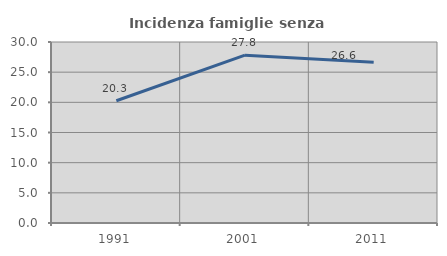
| Category | Incidenza famiglie senza nuclei |
|---|---|
| 1991.0 | 20.256 |
| 2001.0 | 27.813 |
| 2011.0 | 26.642 |